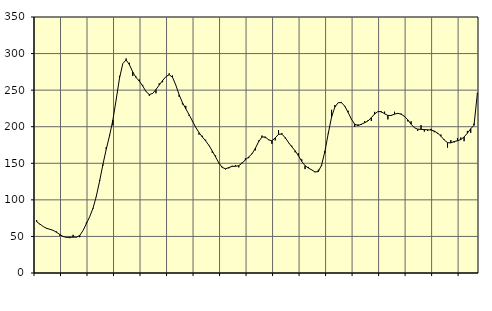
| Category | Piggar | Series 1 |
|---|---|---|
| nan | 72.2 | 70.2 |
| 87.0 | 66.4 | 66.82 |
| 87.0 | 63.4 | 63.47 |
| 87.0 | 60.5 | 61.09 |
| nan | 59.6 | 59.76 |
| 88.0 | 58 | 58.25 |
| 88.0 | 56.7 | 55.61 |
| 88.0 | 50.9 | 52.63 |
| nan | 49.6 | 49.89 |
| 89.0 | 49.3 | 48.65 |
| 89.0 | 47.6 | 48.89 |
| 89.0 | 52.2 | 49.01 |
| nan | 48.7 | 48.93 |
| 90.0 | 48.9 | 51.24 |
| 90.0 | 58 | 58.06 |
| 90.0 | 69.2 | 67.35 |
| nan | 76.8 | 76.92 |
| 91.0 | 87.7 | 88.49 |
| 91.0 | 105.3 | 104.83 |
| 91.0 | 127.1 | 125.73 |
| nan | 146.8 | 148.47 |
| 92.0 | 172 | 169.24 |
| 92.0 | 188.9 | 187.7 |
| 92.0 | 201.9 | 209.04 |
| nan | 236.8 | 237.04 |
| 93.0 | 269.5 | 266.18 |
| 93.0 | 286.3 | 286.27 |
| 93.0 | 293.3 | 291.33 |
| nan | 287.4 | 284.81 |
| 94.0 | 269.3 | 274.79 |
| 94.0 | 268.5 | 267.31 |
| 94.0 | 264.5 | 262.32 |
| nan | 257.2 | 255.71 |
| 95.0 | 247.8 | 248.13 |
| 95.0 | 242.1 | 243.94 |
| 95.0 | 245.7 | 245.47 |
| nan | 245.7 | 250.8 |
| 96.0 | 259.3 | 257.05 |
| 96.0 | 260.8 | 263.1 |
| 96.0 | 268.3 | 268.41 |
| nan | 273 | 271.07 |
| 97.0 | 270.1 | 267.63 |
| 97.0 | 256.9 | 256.92 |
| 97.0 | 241 | 243.66 |
| nan | 230.5 | 232.93 |
| 98.0 | 228.5 | 224.65 |
| 98.0 | 214.8 | 216.46 |
| 98.0 | 207.3 | 207.94 |
| nan | 199.4 | 199.22 |
| 99.0 | 189.2 | 191.87 |
| 99.0 | 187.6 | 185.97 |
| 99.0 | 182.2 | 180.61 |
| nan | 174 | 174.45 |
| 0.0 | 164.4 | 166.86 |
| 0.0 | 160.6 | 158.61 |
| 0.0 | 149.8 | 150.46 |
| nan | 145.3 | 144.3 |
| 1.0 | 141.7 | 142.51 |
| 1.0 | 143.1 | 144.13 |
| 1.0 | 146.6 | 145.79 |
| nan | 147.7 | 145.86 |
| 2.0 | 144.4 | 146.72 |
| 2.0 | 151 | 150.16 |
| 2.0 | 156.8 | 154.74 |
| nan | 157 | 158.65 |
| 3.0 | 163.5 | 162.96 |
| 3.0 | 167.7 | 170.47 |
| 3.0 | 181.1 | 179.65 |
| nan | 187.9 | 185.88 |
| 4.0 | 184.4 | 186 |
| 4.0 | 182.7 | 182.1 |
| 4.0 | 176.6 | 180.67 |
| nan | 181.3 | 184.71 |
| 5.0 | 195.4 | 189.71 |
| 5.0 | 191.3 | 189.88 |
| 5.0 | 184.1 | 185.09 |
| nan | 177.6 | 178.53 |
| 6.0 | 174 | 172.55 |
| 6.0 | 165 | 167.14 |
| 6.0 | 163.6 | 160.45 |
| nan | 155.4 | 152.64 |
| 7.0 | 142 | 146.74 |
| 7.0 | 145 | 143.57 |
| 7.0 | 141.4 | 141.03 |
| nan | 137.8 | 138.16 |
| 8.0 | 141.2 | 138.61 |
| 8.0 | 146.5 | 147.64 |
| 8.0 | 164.2 | 166.57 |
| nan | 191.5 | 190.65 |
| 9.0 | 223.1 | 213.2 |
| 9.0 | 229.6 | 226.84 |
| 9.0 | 232.9 | 232.85 |
| nan | 233.9 | 232.91 |
| 10.0 | 227.5 | 228.07 |
| 10.0 | 221.8 | 219.6 |
| 10.0 | 209.4 | 210.19 |
| nan | 199.7 | 203.49 |
| 11.0 | 203.2 | 201.55 |
| 11.0 | 202.4 | 203.4 |
| 11.0 | 207.6 | 205.46 |
| nan | 208.8 | 207.88 |
| 12.0 | 207.8 | 212.4 |
| 12.0 | 220.3 | 217.37 |
| 12.0 | 220.7 | 220.78 |
| nan | 219.6 | 220.61 |
| 13.0 | 220.6 | 217.74 |
| 13.0 | 210 | 215.42 |
| 13.0 | 216.1 | 215.36 |
| nan | 220.4 | 217.17 |
| 14.0 | 217.5 | 218.3 |
| 14.0 | 217.9 | 217.08 |
| 14.0 | 213.4 | 214.19 |
| nan | 207.3 | 209.42 |
| 15.0 | 207.4 | 203.44 |
| 15.0 | 198.4 | 198.63 |
| 15.0 | 194.3 | 196.64 |
| nan | 202.2 | 196.44 |
| 16.0 | 193.4 | 196.14 |
| 16.0 | 194.3 | 195.8 |
| 16.0 | 197.1 | 195.47 |
| nan | 192.5 | 194.08 |
| 17.0 | 190.2 | 191.38 |
| 17.0 | 189.3 | 187.09 |
| 17.0 | 182.4 | 181.9 |
| nan | 171.5 | 178.2 |
| 18.0 | 181.7 | 177.91 |
| 18.0 | 178.5 | 179.66 |
| 18.0 | 184.6 | 180.81 |
| nan | 185.2 | 182.46 |
| 19.0 | 180.2 | 185.97 |
| 19.0 | 194.2 | 191.15 |
| 19.0 | 191.6 | 197.2 |
| nan | 204.1 | 202.02 |
| 20.0 | 246.3 | 245.17 |